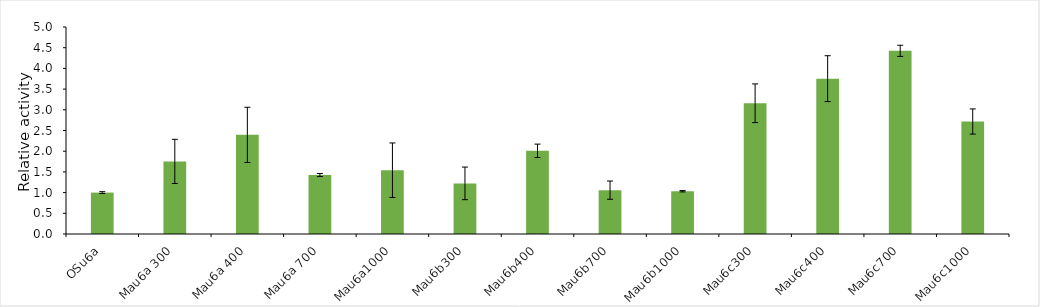
| Category | Series 0 |
|---|---|
| OSu6a | 1 |
| Mau6a 300 | 1.754 |
| Mau6a 400 | 2.394 |
| Mau6a 700 | 1.424 |
| Mau6a1000 | 1.541 |
| Mau6b300 | 1.223 |
| Mau6b400 | 2.009 |
| Mau6b700 | 1.06 |
| Mau6b1000 | 1.033 |
| Mau6c300 | 3.158 |
| Mau6c400 | 3.753 |
| Mau6c700 | 4.424 |
| Mau6c1000 | 2.717 |